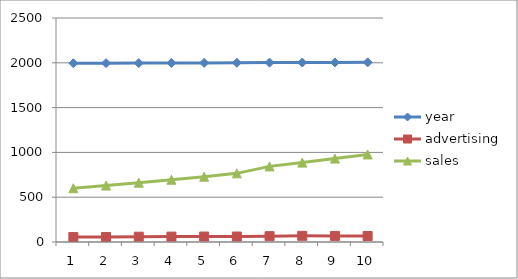
| Category | year | advertising | sales |
|---|---|---|---|
| 0 | 1995 | 56 | 600 |
| 1 | 1996 | 56 | 630 |
| 2 | 1997 | 59 | 662 |
| 3 | 1998 | 60 | 695 |
| 4 | 1999 | 61 | 729 |
| 5 | 2000 | 61 | 766 |
| 6 | 2002 | 65 | 844 |
| 7 | 2003 | 69 | 886 |
| 8 | 2004 | 68 | 931 |
| 9 | 2005 | 67 | 977 |